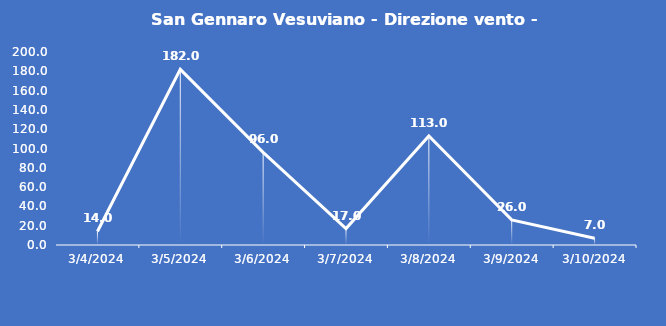
| Category | San Gennaro Vesuviano - Direzione vento - Grezzo (°N) |
|---|---|
| 3/4/24 | 14 |
| 3/5/24 | 182 |
| 3/6/24 | 96 |
| 3/7/24 | 17 |
| 3/8/24 | 113 |
| 3/9/24 | 26 |
| 3/10/24 | 7 |